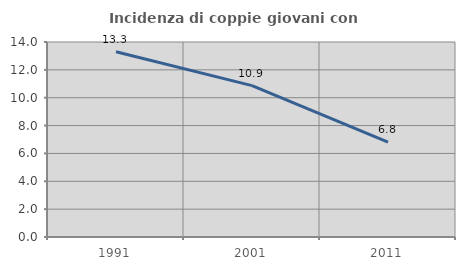
| Category | Incidenza di coppie giovani con figli |
|---|---|
| 1991.0 | 13.303 |
| 2001.0 | 10.87 |
| 2011.0 | 6.818 |